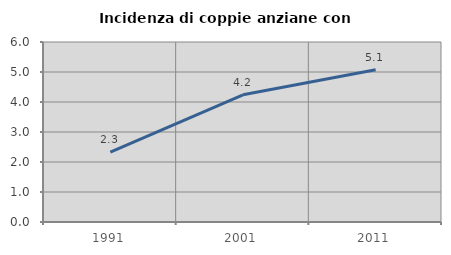
| Category | Incidenza di coppie anziane con figli |
|---|---|
| 1991.0 | 2.326 |
| 2001.0 | 4.24 |
| 2011.0 | 5.072 |